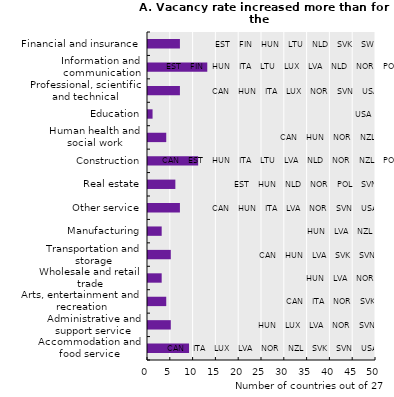
| Category | Number of countries | Labels SPOTS |
|---|---|---|
| Accommodation and food service | 9 | 50 |
| Administrative and support service | 5 | 50 |
| Arts, entertainment and recreation | 4 | 50 |
| Wholesale and retail trade | 3 | 50 |
| Transportation and storage | 5 | 50 |
| Manufacturing | 3 | 50 |
| Other service | 7 | 50 |
| Real estate | 6 | 50 |
| Construction | 11 | 50 |
| Human health and social work | 4 | 50 |
| Education | 1 | 50 |
| Professional, scientific and technical | 7 | 50 |
| Information and communication | 13 | 50 |
| Financial and insurance | 7 | 50 |